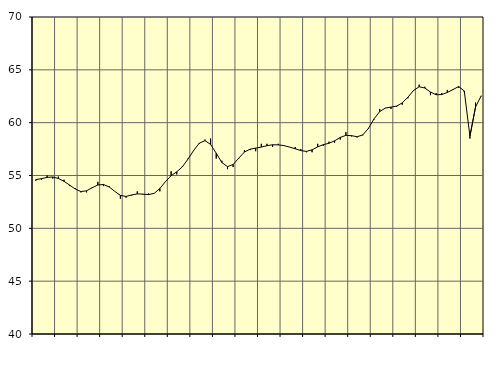
| Category | Piggar | Samtliga fast anställda (inkl. fast anställda utomlands) |
|---|---|---|
| nan | 54.5 | 54.61 |
| 1.0 | 54.6 | 54.7 |
| 1.0 | 55 | 54.82 |
| 1.0 | 54.7 | 54.86 |
| nan | 54.9 | 54.72 |
| 2.0 | 54.6 | 54.45 |
| 2.0 | 54 | 54.09 |
| 2.0 | 53.8 | 53.72 |
| nan | 53.4 | 53.48 |
| 3.0 | 53.4 | 53.55 |
| 3.0 | 53.9 | 53.84 |
| 3.0 | 54.4 | 54.1 |
| nan | 54 | 54.15 |
| 4.0 | 54 | 53.92 |
| 4.0 | 53.5 | 53.5 |
| 4.0 | 52.8 | 53.12 |
| nan | 52.9 | 53.02 |
| 5.0 | 53.1 | 53.16 |
| 5.0 | 53.5 | 53.26 |
| 5.0 | 53.2 | 53.24 |
| nan | 53.3 | 53.19 |
| 6.0 | 53.3 | 53.31 |
| 6.0 | 53.5 | 53.77 |
| 6.0 | 54.4 | 54.42 |
| nan | 55.4 | 54.98 |
| 7.0 | 55.1 | 55.35 |
| 7.0 | 55.9 | 55.82 |
| 7.0 | 56.6 | 56.56 |
| nan | 57.4 | 57.37 |
| 8.0 | 58 | 58.06 |
| 8.0 | 58.4 | 58.3 |
| 8.0 | 58.5 | 57.94 |
| nan | 56.6 | 57.11 |
| 9.0 | 56.4 | 56.23 |
| 9.0 | 55.6 | 55.84 |
| 9.0 | 55.8 | 56.04 |
| nan | 56.6 | 56.64 |
| 10.0 | 57.4 | 57.22 |
| 10.0 | 57.4 | 57.49 |
| 10.0 | 57.3 | 57.59 |
| nan | 58 | 57.69 |
| 11.0 | 58 | 57.82 |
| 11.0 | 57.7 | 57.91 |
| 11.0 | 58 | 57.9 |
| nan | 57.8 | 57.83 |
| 12.0 | 57.7 | 57.69 |
| 12.0 | 57.7 | 57.53 |
| 12.0 | 57.5 | 57.36 |
| nan | 57.2 | 57.28 |
| 13.0 | 57.2 | 57.43 |
| 13.0 | 58 | 57.71 |
| 13.0 | 57.8 | 57.92 |
| nan | 58.2 | 58.05 |
| 14.0 | 58.1 | 58.28 |
| 14.0 | 58.4 | 58.6 |
| 14.0 | 59.1 | 58.8 |
| nan | 58.7 | 58.77 |
| 15.0 | 58.6 | 58.67 |
| 15.0 | 58.8 | 58.84 |
| 15.0 | 59.4 | 59.46 |
| nan | 60.3 | 60.36 |
| 16.0 | 61.3 | 61.05 |
| 16.0 | 61.4 | 61.38 |
| 16.0 | 61.3 | 61.47 |
| nan | 61.5 | 61.57 |
| 17.0 | 61.7 | 61.87 |
| 17.0 | 62.3 | 62.41 |
| 17.0 | 63 | 63.05 |
| nan | 63.6 | 63.4 |
| 18.0 | 63.4 | 63.28 |
| 18.0 | 62.6 | 62.9 |
| 18.0 | 62.8 | 62.64 |
| nan | 62.8 | 62.66 |
| 19.0 | 63.1 | 62.86 |
| 19.0 | 63.1 | 63.13 |
| 19.0 | 63.3 | 63.42 |
| nan | 62.9 | 63 |
| 20.0 | 58.5 | 58.72 |
| 20.0 | 61.9 | 61.48 |
| 20.0 | 62.5 | 62.54 |